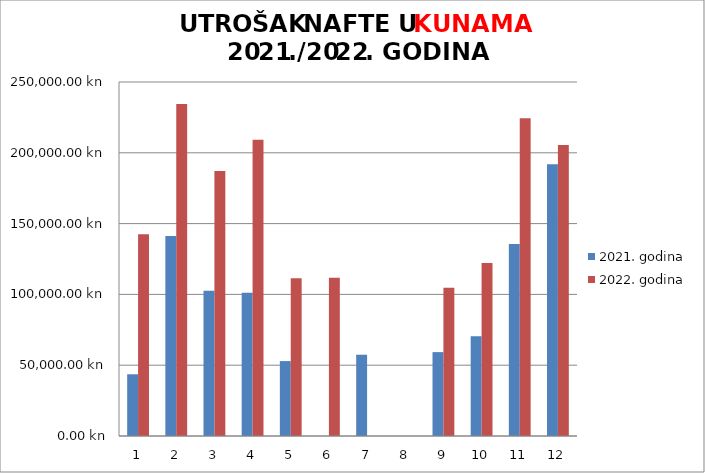
| Category | 2021. godina | 2022. godina |
|---|---|---|
| 0 | 43590 | 142515 |
| 1 | 141167.53 | 234435 |
| 2 | 102629.93 | 187232.5 |
| 3 | 101121.11 | 209182.28 |
| 4 | 52898.83 | 111480 |
| 5 | 0 | 111810 |
| 6 | 57394.13 | 0 |
| 7 | 0 | 0 |
| 8 | 59239.94 | 104775 |
| 9 | 70385.86 | 122100 |
| 10 | 135585 | 224469.74 |
| 11 | 191862 | 205478.53 |